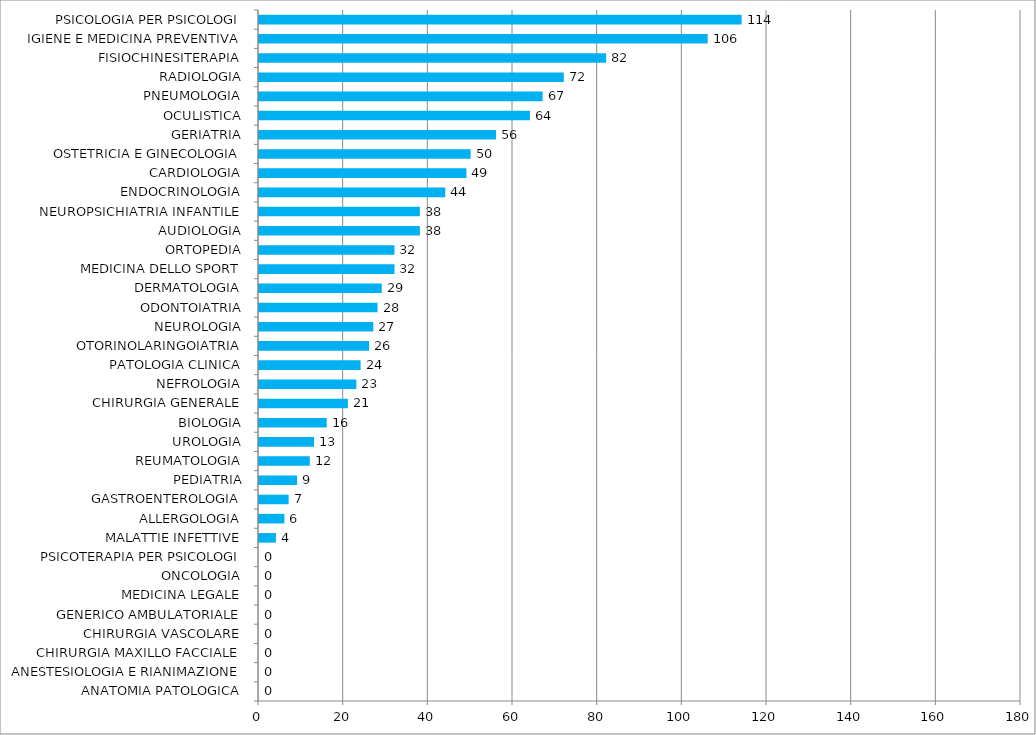
| Category | Series 0 |
|---|---|
| ANATOMIA PATOLOGICA | 0 |
| ANESTESIOLOGIA E RIANIMAZIONE | 0 |
| CHIRURGIA MAXILLO FACCIALE | 0 |
| CHIRURGIA VASCOLARE | 0 |
| GENERICO AMBULATORIALE | 0 |
| MEDICINA LEGALE | 0 |
| ONCOLOGIA | 0 |
| PSICOTERAPIA PER PSICOLOGI | 0 |
| MALATTIE INFETTIVE | 4 |
| ALLERGOLOGIA | 6 |
| GASTROENTEROLOGIA | 7 |
| PEDIATRIA | 9 |
| REUMATOLOGIA | 12 |
| UROLOGIA | 13 |
| BIOLOGIA | 16 |
| CHIRURGIA GENERALE | 21 |
| NEFROLOGIA | 23 |
| PATOLOGIA CLINICA | 24 |
| OTORINOLARINGOIATRIA | 26 |
| NEUROLOGIA | 27 |
| ODONTOIATRIA | 28 |
| DERMATOLOGIA | 29 |
| MEDICINA DELLO SPORT | 32 |
| ORTOPEDIA | 32 |
| AUDIOLOGIA | 38 |
| NEUROPSICHIATRIA INFANTILE | 38 |
| ENDOCRINOLOGIA | 44 |
| CARDIOLOGIA | 49 |
| OSTETRICIA E GINECOLOGIA | 50 |
| GERIATRIA | 56 |
| OCULISTICA | 64 |
| PNEUMOLOGIA | 67 |
| RADIOLOGIA | 72 |
| FISIOCHINESITERAPIA | 82 |
| IGIENE E MEDICINA PREVENTIVA | 106 |
| PSICOLOGIA PER PSICOLOGI | 114 |